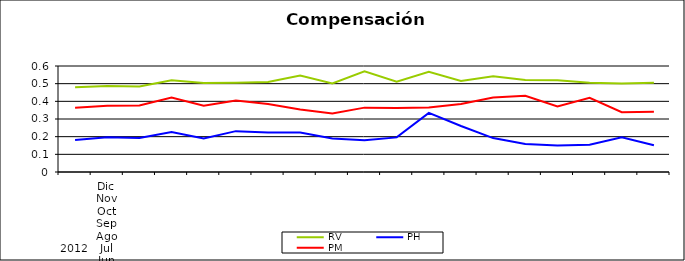
| Category | RV | PH | PM |
|---|---|---|---|
| 0 | 0.479 | 0.181 | 0.364 |
| 1 | 0.487 | 0.196 | 0.375 |
| 2 | 0.484 | 0.192 | 0.376 |
| 3 | 0.52 | 0.226 | 0.421 |
| 4 | 0.504 | 0.189 | 0.375 |
| 5 | 0.506 | 0.231 | 0.404 |
| 6 | 0.51 | 0.224 | 0.384 |
| 7 | 0.546 | 0.223 | 0.353 |
| 8 | 0.501 | 0.19 | 0.331 |
| 9 | 0.57 | 0.18 | 0.364 |
| 10 | 0.511 | 0.196 | 0.363 |
| 11 | 0.567 | 0.335 | 0.365 |
| 12 | 0.515 | 0.26 | 0.385 |
| 13 | 0.543 | 0.192 | 0.422 |
| 14 | 0.52 | 0.158 | 0.431 |
| 15 | 0.519 | 0.15 | 0.371 |
| 16 | 0.505 | 0.154 | 0.42 |
| 17 | 0.501 | 0.196 | 0.339 |
| 18 | 0.506 | 0.151 | 0.341 |